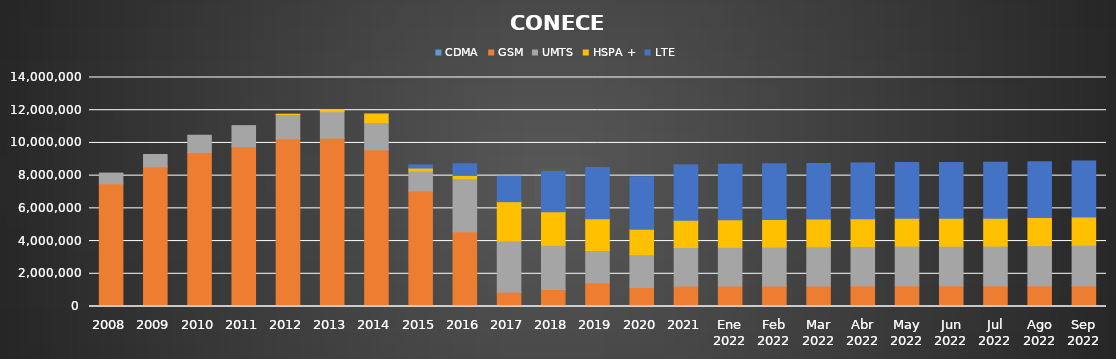
| Category | CDMA | GSM | UMTS | HSPA + | LTE |
|---|---|---|---|---|---|
| 2008 | 0 | 7499370 | 656989 | 0 | 0 |
| 2009 | 0 | 8532691 | 758577 | 0 | 0 |
| 2010 | 0 | 9419193 | 1051309 | 0 | 0 |
| 2011 | 0 | 9774865 | 1282451 | 0 | 0 |
| 2012 | 0 | 10252457 | 1484003 | 21446 | 0 |
| 2013 | 0 | 10287259 | 1622034 | 121593 | 0 |
| 2014 | 0 | 9581956 | 1664758 | 525306 | 0 |
| 2015 | 0 | 7065313 | 1214567 | 183109 | 195630 |
| 2016 | 0 | 4571999 | 3240700 | 201567 | 712557 |
| 2017 | 0 | 873346 | 3135577 | 2399460 | 1551880 |
| 2018 | 0 | 1039373 | 2706058 | 2049418 | 2453201 |
| 2019 | 0 | 1452334 | 1970422 | 1937931 | 3132367 |
| 2020 | 0 | 1158751 | 2009264 | 1548440 | 3212798 |
| 2021 | 0 | 1250925 | 2353798 | 1675346 | 3385646 |
| Ene 2022 | 0 | 1253803 | 2367204 | 1682872 | 3391452 |
| Feb 2022 | 0 | 1256245 | 2379435 | 1688963 | 3397299 |
| Mar 2022 | 0 | 1259631 | 2392596 | 1693034 | 3401696 |
| Abr 2022 | 0 | 1264438 | 2406911 | 1697322 | 3404685 |
| May 2022 | 0 | 1270140 | 2426173 | 1703122 | 3410983 |
| Jun 2022 | 0 | 1262085 | 2423097 | 1704279 | 3412930 |
| Jul 2022 | 0 | 1263792 | 2429301 | 1706746 | 3411593 |
| Ago 2022 | 0 | 1267014 | 2455439 | 1715007 | 3418449 |
| Sep 2022 | 0 | 1270438 | 2475907 | 1721545 | 3432386 |